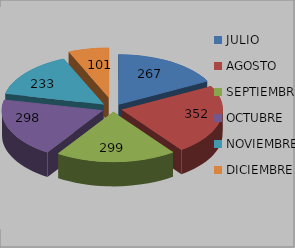
| Category | Series 0 |
|---|---|
| JULIO | 267 |
| AGOSTO | 352 |
| SEPTIEMBRE | 299 |
| OCTUBRE | 298 |
| NOVIEMBRE | 233 |
| DICIEMBRE | 101 |